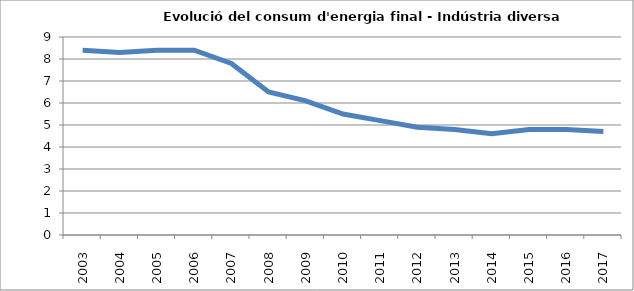
| Category | 8,4 8,3 8,4 8,4 7,8 6,5 6,1 5,5 5,2 4,9 4,8 4,6 4,8 4,8 4,7 |
|---|---|
| 2003.0 | 8.4 |
| 2004.0 | 8.3 |
| 2005.0 | 8.4 |
| 2006.0 | 8.4 |
| 2007.0 | 7.8 |
| 2008.0 | 6.5 |
| 2009.0 | 6.1 |
| 2010.0 | 5.5 |
| 2011.0 | 5.2 |
| 2012.0 | 4.9 |
| 2013.0 | 4.8 |
| 2014.0 | 4.6 |
| 2015.0 | 4.8 |
| 2016.0 | 4.8 |
| 2017.0 | 4.7 |